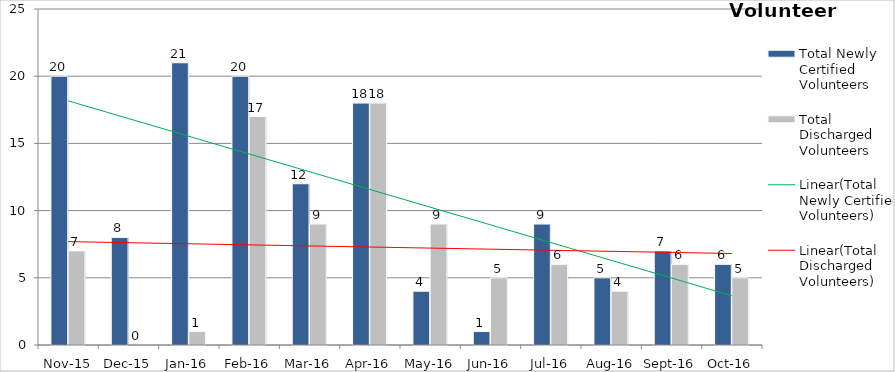
| Category | Total Newly Certified Volunteers | Total Discharged Volunteers |
|---|---|---|
| Nov-15 | 20 | 7 |
| Dec-15 | 8 | 0 |
| Jan-16 | 21 | 1 |
| Feb-16 | 20 | 17 |
| Mar-16 | 12 | 9 |
| Apr-16 | 18 | 18 |
| May-16 | 4 | 9 |
| Jun-16 | 1 | 5 |
| Jul-16 | 9 | 6 |
| Aug-16 | 5 | 4 |
| Sep-16 | 7 | 6 |
| Oct-16 | 6 | 5 |